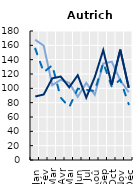
| Category | 2019 | 2020 | 2021 |
|---|---|---|---|
| Jan | 167.764 | 155.353 | 88.606 |
| Fév | 159.387 | 122.475 | 91.404 |
| Mar | 104.404 | 132.21 | 113.979 |
| Avr | 111.923 | 86.917 | 116.418 |
| Mai | 107.652 | 73.824 | 101.393 |
| Jun | 88.091 | 99.543 | 118.316 |
| Jul | 107.578 | 97.776 | 87.025 |
| Aoû | 91.073 | 96.276 | 115.586 |
| Sep | 134.62 | 135.528 | 153.343 |
| Oct | 137.157 | 102.243 | 104.882 |
| Nov | 111.383 | 111.989 | 154.008 |
| Déc | 94.536 | 77.806 | 100.908 |